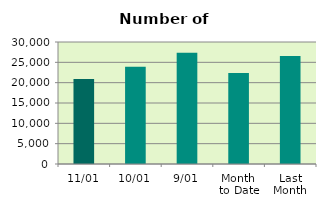
| Category | Series 0 |
|---|---|
| 11/01 | 20912 |
| 10/01 | 23934 |
| 9/01 | 27330 |
| Month 
to Date | 22403.25 |
| Last
Month | 26558.947 |